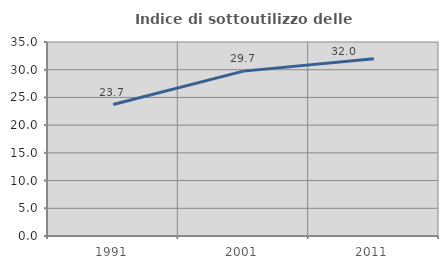
| Category | Indice di sottoutilizzo delle abitazioni  |
|---|---|
| 1991.0 | 23.723 |
| 2001.0 | 29.746 |
| 2011.0 | 31.983 |